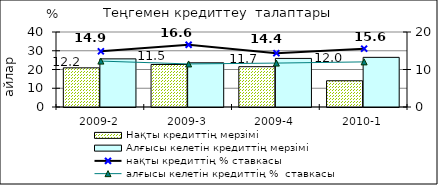
| Category | Нақты кредиттің мерзімі  | Алғысы келетін кредиттің мерзімі  |
|---|---|---|
| 2009-2 | 20.89 | 25.67 |
| 2009-3 | 22.67 | 23.58 |
| 2009-4 | 21.5 | 25.91 |
| 2010-1 | 14 | 26.48 |